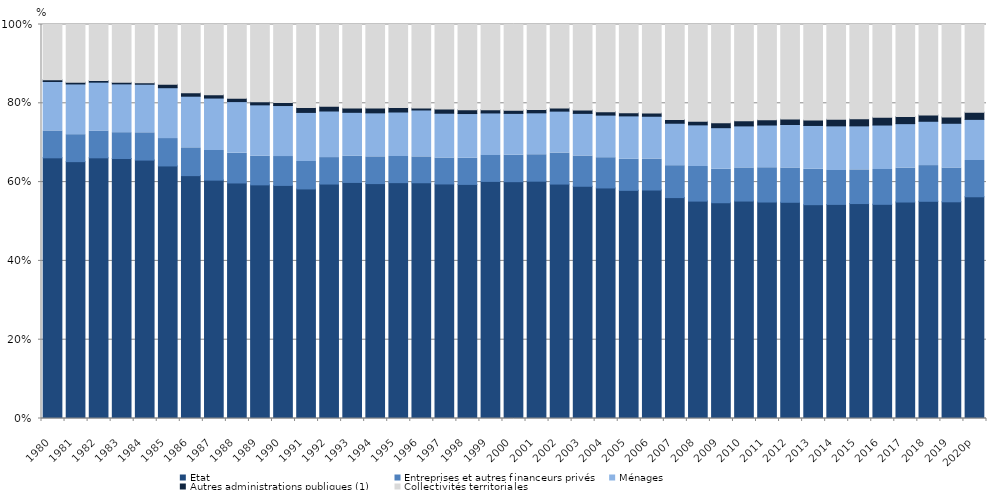
| Category | État | Entreprises et autres financeurs privés | Ménages | Autres administrations publiques (1) | Collectivités territoriales |
|---|---|---|---|---|---|
| 1980 | 66.161 | 6.823 | 12.555 | 0.415 | 14.047 |
| 1981 | 65.193 | 6.85 | 12.869 | 0.448 | 14.64 |
| 1982 | 66.161 | 6.774 | 12.432 | 0.427 | 14.206 |
| 1983 | 65.987 | 6.563 | 12.379 | 0.385 | 14.686 |
| 1984 | 65.589 | 6.927 | 12.326 | 0.386 | 14.772 |
| 1985 | 64.102 | 6.946 | 12.908 | 0.881 | 15.163 |
| 1986 | 61.642 | 7.055 | 13.105 | 0.875 | 17.324 |
| 1987 | 60.502 | 7.516 | 13.312 | 0.846 | 17.824 |
| 1988 | 59.778 | 7.522 | 13.134 | 0.824 | 18.742 |
| 1989 | 59.3 | 7.258 | 13.048 | 0.801 | 19.594 |
| 1990 | 59.16 | 7.329 | 12.945 | 0.783 | 19.784 |
| 1991 | 58.268 | 6.963 | 12.454 | 1.263 | 21.052 |
| 1992 | 59.51 | 6.713 | 11.821 | 1.207 | 20.75 |
| 1993 | 59.917 | 6.655 | 11.136 | 1.07 | 21.222 |
| 1994 | 59.62 | 6.789 | 11.166 | 1.252 | 21.173 |
| 1995 | 59.861 | 6.656 | 11.274 | 1.114 | 21.096 |
| 1996 | 59.835 | 6.567 | 11.901 | 0.495 | 21.202 |
| 1997 | 59.53 | 6.586 | 11.365 | 1.048 | 21.472 |
| 1998 | 59.419 | 6.633 | 11.348 | 0.969 | 21.631 |
| 1999 | 60.181 | 6.602 | 10.764 | 0.804 | 21.649 |
| 2000 | 60.11 | 6.705 | 10.622 | 0.822 | 21.741 |
| 2001 | 60.235 | 6.713 | 10.631 | 0.837 | 21.584 |
| 2002 | 59.502 | 7.872 | 10.64 | 0.805 | 21.182 |
| 2003 | 58.948 | 7.672 | 10.821 | 0.852 | 21.708 |
| 2004 | 58.515 | 7.682 | 10.805 | 0.872 | 22.126 |
| 2005 | 57.909 | 7.895 | 11.002 | 0.794 | 22.4 |
| 2006 | 57.988 | 7.861 | 10.864 | 0.803 | 22.484 |
| 2007 | 56.073 | 8.097 | 10.769 | 0.965 | 24.096 |
| 2008 | 55.181 | 8.774 | 10.569 | 0.916 | 24.559 |
| 2009 | 54.764 | 8.502 | 10.545 | 1.225 | 24.964 |
| 2010 | 55.19 | 8.407 | 10.67 | 1.324 | 24.41 |
| 2011 | 54.946 | 8.702 | 10.837 | 1.328 | 24.187 |
| 2012 | 54.881 | 8.702 | 11.039 | 1.382 | 23.996 |
| 2013 | 54.271 | 8.989 | 11.113 | 1.367 | 24.26 |
| 2014 | 54.34 | 8.628 | 11.306 | 1.688 | 24.038 |
| 2015 | 54.556 | 8.549 | 11.168 | 1.795 | 23.931 |
| 2016 | 54.363 | 8.843 | 11.279 | 1.977 | 23.539 |
| 2017 | 54.946 | 8.62 | 11.269 | 1.802 | 23.362 |
| 2018 | 55.132 | 9.053 | 11.254 | 1.605 | 22.956 |
| 2019 | 55.002 | 8.578 | 11.349 | 1.591 | 23.48 |
| 2020p | 56.279 | 9.201 | 10.437 | 1.83 | 22.254 |